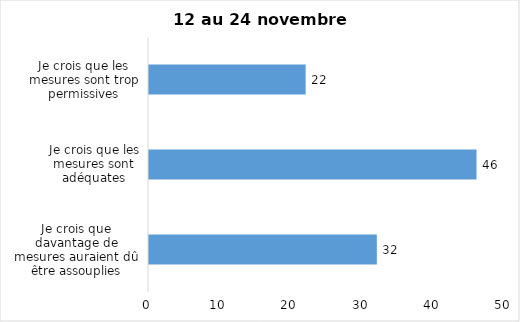
| Category | Series 0 |
|---|---|
| Je crois que davantage de mesures auraient dû être assouplies | 32 |
| Je crois que les mesures sont adéquates | 46 |
| Je crois que les mesures sont trop permissives | 22 |